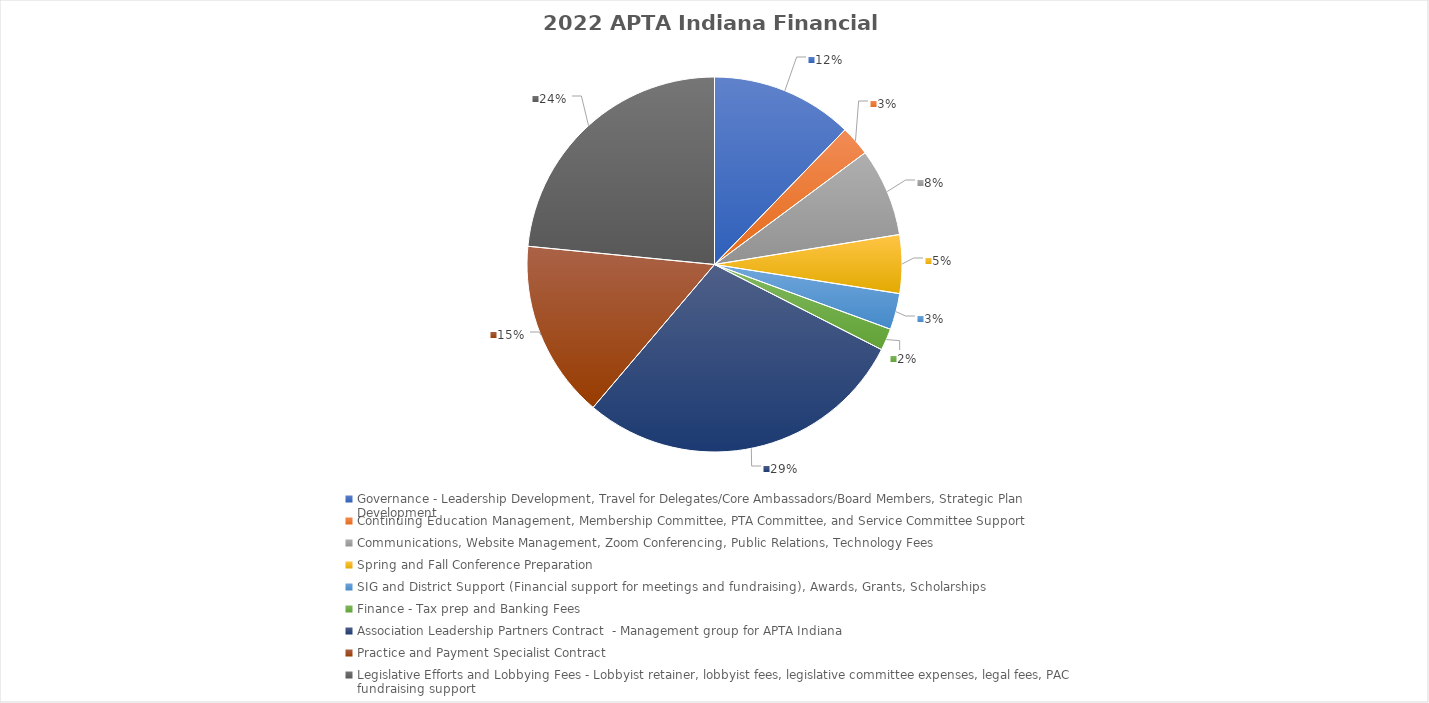
| Category | Series 0 |
|---|---|
| Governance - Leadership Development, Travel for Delegates/Core Ambassadors/Board Members, Strategic Plan Development | 26250 |
| Continuing Education Management, Membership Committee, PTA Committee, and Service Committee Support | 5558 |
| Communications, Website Management, Zoom Conferencing, Public Relations, Technology Fees | 16294.84 |
| Spring and Fall Conference Preparation  | 10816.57 |
| SIG and District Support (Financial support for meetings and fundraising), Awards, Grants, Scholarships | 6694.59 |
| Finance - Tax prep and Banking Fees | 4053.02 |
| Association Leadership Partners Contract  - Management group for APTA Indiana | 61529.19 |
| Practice and Payment Specialist Contract | 32891.57 |
| Legislative Efforts and Lobbying Fees - Lobbyist retainer, lobbyist fees, legislative committee expenses, legal fees, PAC fundraising support | 50262.52 |